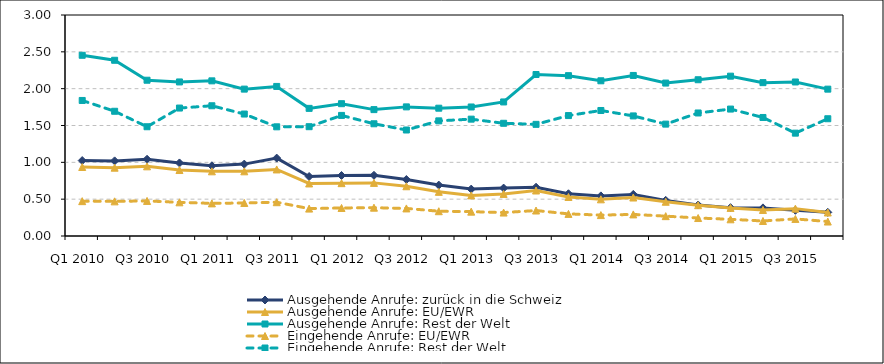
| Category | Ausgehende Anrufe: zurück in die Schweiz | Ausgehende Anrufe: EU/EWR | Ausgehende Anrufe: Rest der Welt | Eingehende Anrufe: EU/EWR | Eingehende Anrufe: Rest der Welt |
|---|---|---|---|---|---|
| Q1 2010 | 1.024 | 0.937 | 2.453 | 0.473 | 1.84 |
| Q2 2010 | 1.02 | 0.927 | 2.385 | 0.47 | 1.693 |
| Q3 2010 | 1.042 | 0.946 | 2.115 | 0.476 | 1.483 |
| Q4 2010 | 0.992 | 0.896 | 2.091 | 0.457 | 1.737 |
| Q1 2011 | 0.953 | 0.878 | 2.106 | 0.443 | 1.768 |
| Q2 2011 | 0.976 | 0.878 | 1.994 | 0.449 | 1.656 |
| Q3 2011 | 1.058 | 0.903 | 2.03 | 0.459 | 1.482 |
| Q4 2011 | 0.808 | 0.713 | 1.733 | 0.372 | 1.484 |
| Q1 2012 | 0.821 | 0.717 | 1.796 | 0.381 | 1.637 |
| Q2 2012 | 0.824 | 0.721 | 1.716 | 0.384 | 1.523 |
| Q3 2012 | 0.767 | 0.675 | 1.753 | 0.374 | 1.439 |
| Q4 2012 | 0.691 | 0.599 | 1.735 | 0.336 | 1.563 |
| Q1 2013 | 0.637 | 0.551 | 1.751 | 0.331 | 1.586 |
| Q2 2013 | 0.65 | 0.571 | 1.82 | 0.318 | 1.53 |
| Q3 2013 | 0.662 | 0.618 | 2.192 | 0.346 | 1.516 |
| Q4 2013 | 0.573 | 0.53 | 2.177 | 0.3 | 1.635 |
| Q1 2014 | 0.544 | 0.498 | 2.107 | 0.284 | 1.704 |
| Q2 2014 | 0.565 | 0.522 | 2.179 | 0.293 | 1.63 |
| Q3 2014 | 0.484 | 0.465 | 2.076 | 0.269 | 1.519 |
| Q4 2014 | 0.421 | 0.418 | 2.121 | 0.244 | 1.67 |
| Q1 2015 | 0.385 | 0.382 | 2.17 | 0.227 | 1.723 |
| Q2 2015 | 0.382 | 0.354 | 2.082 | 0.204 | 1.609 |
| Q3 2015 | 0.349 | 0.372 | 2.091 | 0.232 | 1.396 |
| Q4 2015 | 0.321 | 0.319 | 1.994 | 0.196 | 1.592 |